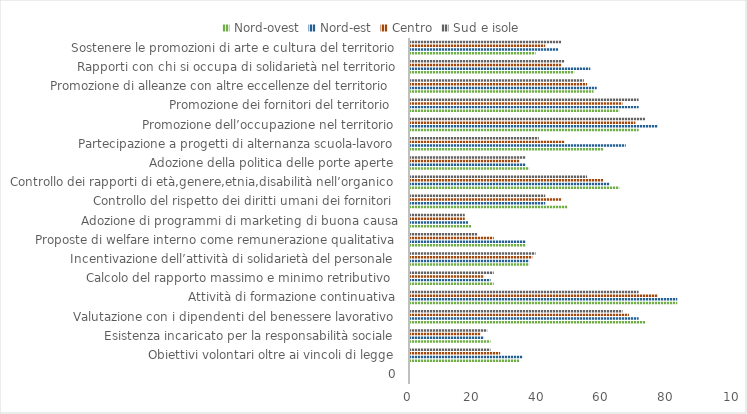
| Category | Nord-ovest | Nord-est | Centro | Sud e isole |
|---|---|---|---|---|
| 0 | 0 | 0 | 0 | 0 |
| Obiettivi volontari oltre ai vincoli di legge | 34 | 35 | 28 | 25 |
| Esistenza incaricato per la responsabilità sociale | 25 | 23 | 22 | 24 |
| Valutazione con i dipendenti del benessere lavorativo | 73 | 71 | 68 | 66 |
| Attività di formazione continuativa | 83 | 83 | 77 | 71 |
|  Calcolo del rapporto massimo e minimo retributivo  | 26 | 25 | 23 | 26 |
|  Incentivazione dell’attività di solidarietà del personale | 37 | 37 | 38 | 39 |
|  Proposte di welfare interno come remunerazione qualitativa | 36 | 36 | 26 | 21 |
| Adozione di programmi di marketing di buona causa | 19 | 18 | 17 | 17 |
|  Controllo del rispetto dei diritti umani dei fornitori  | 49 | 42 | 47 | 42 |
| Controllo dei rapporti di età,genere,etnia,disabilità nell’organico | 65 | 62 | 60 | 55 |
|  Adozione della politica delle porte aperte | 37 | 36 | 34 | 36 |
| Partecipazione a progetti di alternanza scuola-lavoro | 60 | 67 | 48 | 40 |
| Promozione dell’occupazione nel territorio | 71 | 77 | 70 | 73 |
| Promozione dei fornitori del territorio  | 65 | 71 | 66 | 71 |
| Promozione di alleanze con altre eccellenze del territorio  | 57 | 58 | 55 | 54 |
| Rapporti con chi si occupa di solidarietà nel territorio | 51 | 56 | 47 | 48 |
| Sostenere le promozioni di arte e cultura del territorio | 39 | 46 | 42 | 47 |